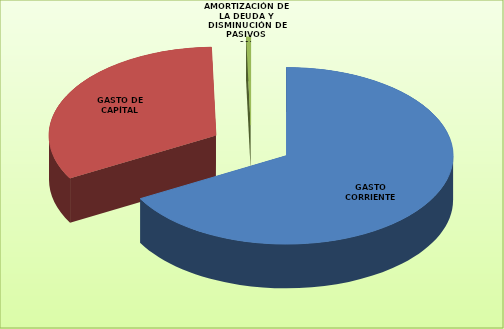
| Category | Series 0 |
|---|---|
| GASTO CORRIENTE | 52054289 |
| GASTO DE CAPÍTAL | 25392593 |
| AMORTIZACIÓN DE LA DEUDA Y DISMINUCIÓN DE PASIVOS | 335000 |